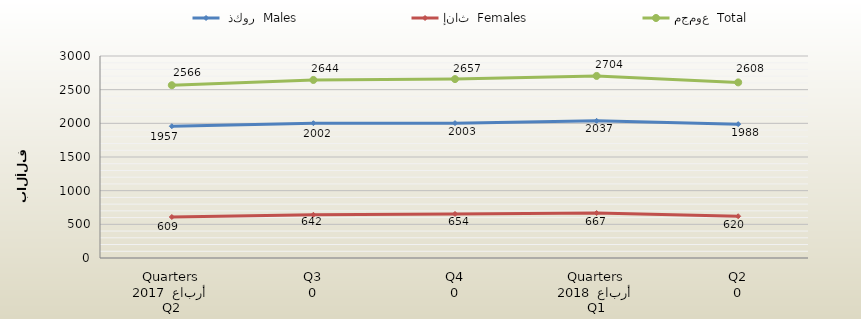
| Category |  ذكور  Males | إناث  Females | مجموع  Total |
|---|---|---|---|
| 0 | 1957 | 609 | 2566 |
| 1 | 2002 | 642 | 2644 |
| 2 | 2003 | 654 | 2657 |
| 3 | 2037 | 667 | 2704 |
| 4 | 1988 | 620 | 2608 |